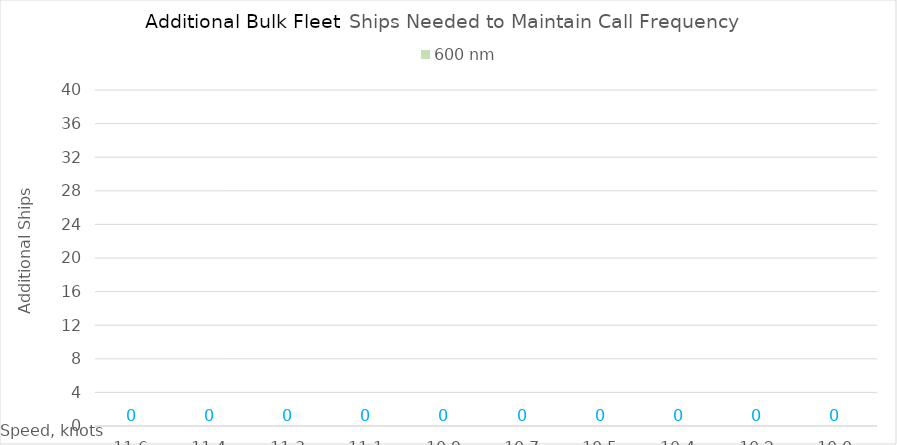
| Category | 600 |
|---|---|
| 11.620000000000001 | 0 |
| 11.440000000000001 | 0 |
| 11.260000000000002 | 0 |
| 11.080000000000002 | 0 |
| 10.900000000000002 | 0 |
| 10.720000000000002 | 0 |
| 10.540000000000003 | 0 |
| 10.360000000000003 | 0 |
| 10.180000000000003 | 0 |
| 10.000000000000004 | 0 |